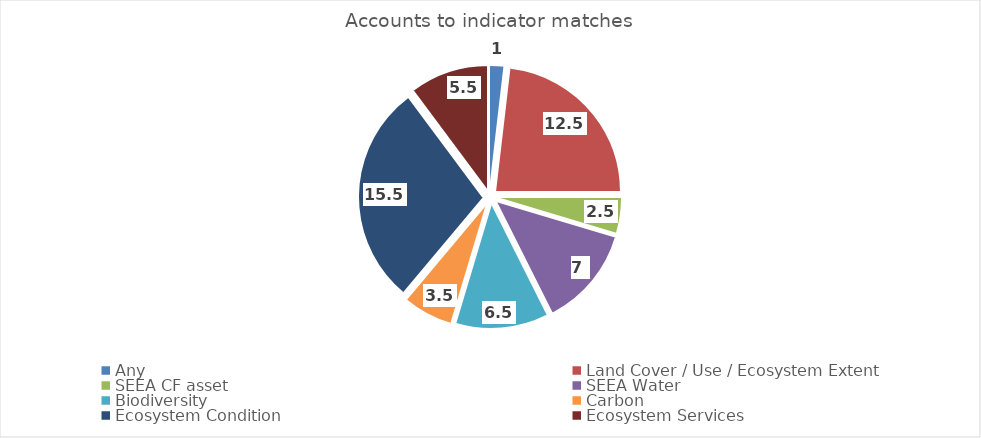
| Category | Series 0 |
|---|---|
| Any | 1 |
| Land Cover / Use / Ecosystem Extent | 12.5 |
| SEEA CF asset | 2.5 |
| SEEA Water | 7 |
| Biodiversity | 6.5 |
| Carbon | 3.5 |
| Ecosystem Condition | 15.5 |
| Ecosystem Services | 5.5 |